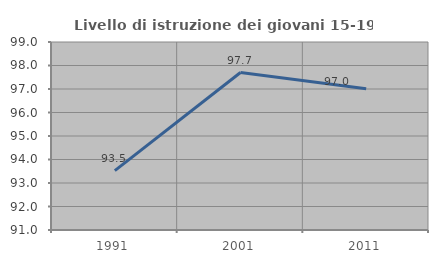
| Category | Livello di istruzione dei giovani 15-19 anni |
|---|---|
| 1991.0 | 93.525 |
| 2001.0 | 97.701 |
| 2011.0 | 97.015 |